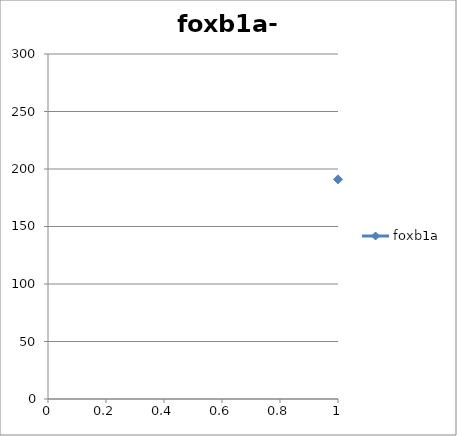
| Category | foxb1a |
|---|---|
| 0 | 191 |
| 1 | 31 |
| 2 | 97 |
| 3 | 284 |
| 4 | 42 |
| 5 | 11 |
| 6 | 31 |
| 7 | 4 |
| 8 | 4 |
| 9 | 1 |
| 10 | 1 |